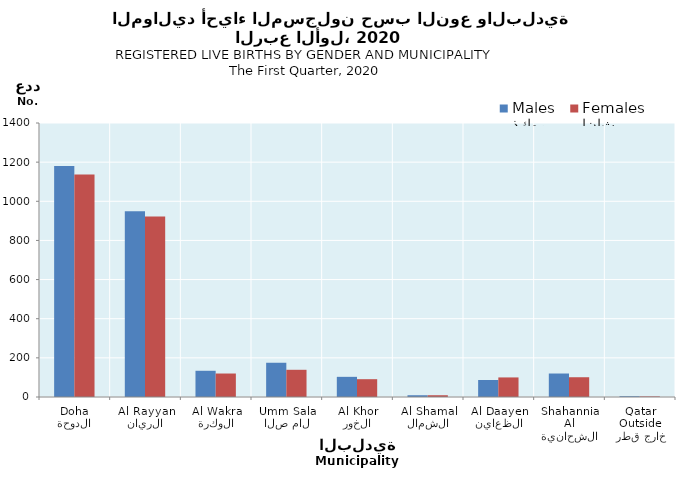
| Category | ذكور
Males | إناث
Females |
|---|---|---|
| الدوحة
Doha | 1180 | 1137 |
| الريان
Al Rayyan | 949 | 922 |
| الوكرة
Al Wakra | 134 | 120 |
| ام صلال
Umm Salal | 175 | 139 |
| الخور
Al Khor | 103 | 91 |
| الشمال
Al Shamal | 9 | 9 |
| الظعاين
Al Daayen | 87 | 100 |
| الشحانية
Al Shahannia | 120 | 101 |
| خارج قطر
Outside Qatar | 4 | 3 |